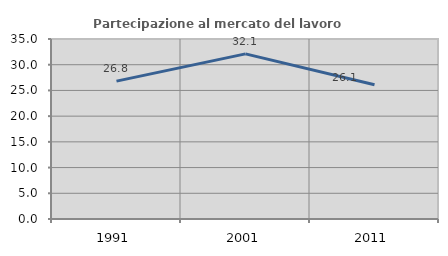
| Category | Partecipazione al mercato del lavoro  femminile |
|---|---|
| 1991.0 | 26.809 |
| 2001.0 | 32.112 |
| 2011.0 | 26.12 |